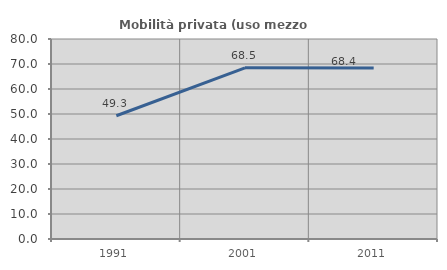
| Category | Mobilità privata (uso mezzo privato) |
|---|---|
| 1991.0 | 49.296 |
| 2001.0 | 68.48 |
| 2011.0 | 68.354 |